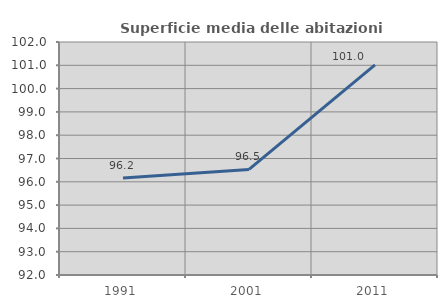
| Category | Superficie media delle abitazioni occupate |
|---|---|
| 1991.0 | 96.164 |
| 2001.0 | 96.532 |
| 2011.0 | 101.019 |